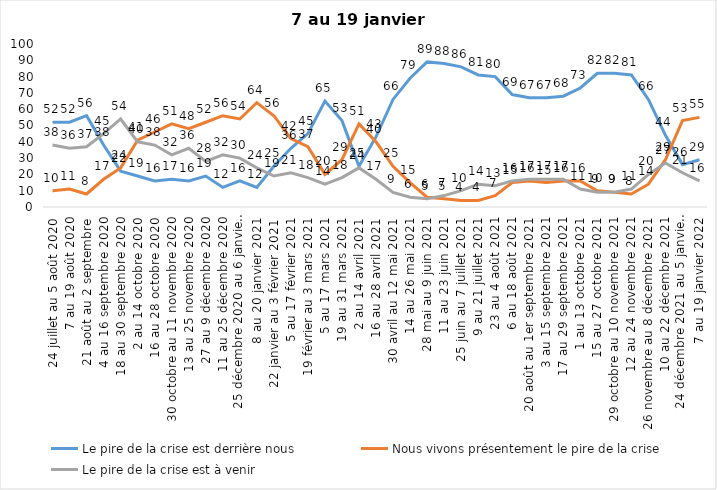
| Category | Le pire de la crise est derrière nous | Nous vivons présentement le pire de la crise | Le pire de la crise est à venir |
|---|---|---|---|
| 24 juillet au 5 août 2020 | 52 | 10 | 38 |
| 7 au 19 août 2020 | 52 | 11 | 36 |
| 21 août au 2 septembre | 56 | 8 | 37 |
| 4 au 16 septembre 2020 | 38 | 17 | 45 |
| 18 au 30 septembre 2020 | 22 | 24 | 54 |
| 2 au 14 octobre 2020 | 19 | 41 | 40 |
| 16 au 28 octobre 2020 | 16 | 46 | 38 |
| 30 octobre au 11 novembre 2020 | 17 | 51 | 32 |
| 13 au 25 novembre 2020 | 16 | 48 | 36 |
| 27 au 9 décembre 2020 | 19 | 52 | 28 |
| 11 au 25 décembre 2020 | 12 | 56 | 32 |
| 25 décembre 2020 au 6 janvier 2021 | 16 | 54 | 30 |
| 8 au 20 janvier 2021 | 12 | 64 | 24 |
| 22 janvier au 3 février 2021 | 25 | 56 | 19 |
| 5 au 17 février 2021 | 36 | 42 | 21 |
| 19 février au 3 mars 2021 | 45 | 37 | 18 |
| 5 au 17 mars 2021 | 65 | 20 | 14 |
| 19 au 31 mars 2021 | 53 | 29 | 18 |
| 2 au 14 avril 2021 | 25 | 51 | 24 |
| 16 au 28 avril 2021 | 43 | 40 | 17 |
| 30 avril au 12 mai 2021 | 66 | 25 | 9 |
| 14 au 26 mai 2021 | 79 | 15 | 6 |
| 28 mai au 9 juin 2021 | 89 | 6 | 5 |
| 11 au 23 juin 2021 | 88 | 5 | 7 |
| 25 juin au 7 juillet 2021 | 86 | 4 | 10 |
| 9 au 21 juillet 2021 | 81 | 4 | 14 |
| 23 au 4 août 2021 | 80 | 7 | 13 |
| 6 au 18 août 2021 | 69 | 15 | 16 |
| 20 août au 1er septembre 2021 | 67 | 16 | 17 |
| 3 au 15 septembre 2021 | 67 | 15 | 17 |
| 17 au 29 septembre 2021 | 68 | 16 | 17 |
| 1 au 13 octobre 2021 | 73 | 16 | 11 |
| 15 au 27 octobre 2021 | 82 | 10 | 9 |
| 29 octobre au 10 novembre 2021 | 82 | 9 | 9 |
| 12 au 24 novembre 2021 | 81 | 8 | 11 |
| 26 novembre au 8 décembre 2021 | 66 | 14 | 20 |
| 10 au 22 décembre 2021 | 44 | 29 | 27 |
| 24 décembre 2021 au 5 janvier 2022 | 26 | 53 | 21 |
| 7 au 19 janvier 2022 | 29 | 55 | 16 |